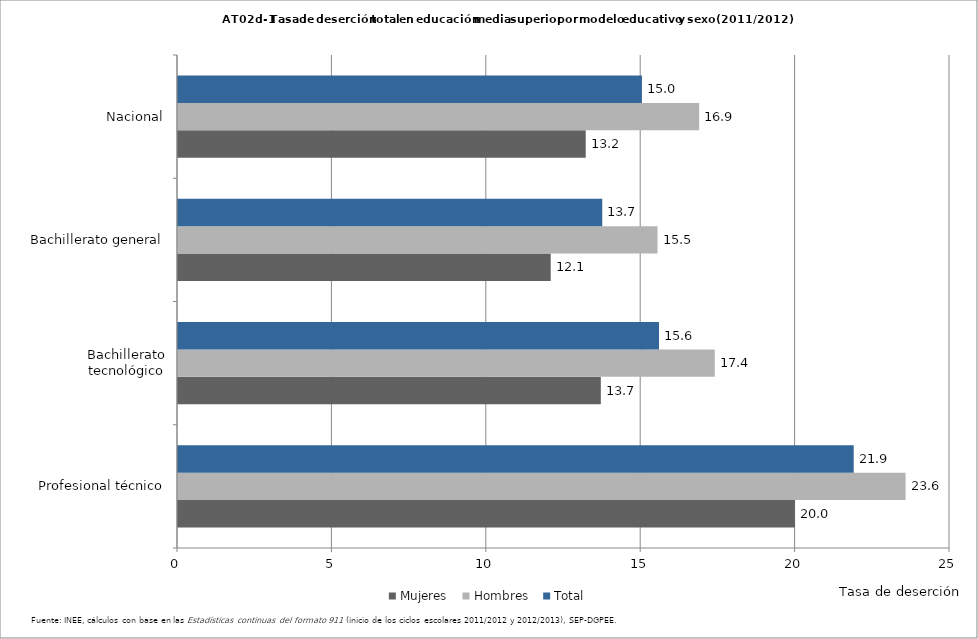
| Category | Mujeres | Hombres | Total |
|---|---|---|---|
| Profesional técnico | 19.978 | 23.562 | 21.881 |
| Bachillerato tecnológico | 13.693 | 17.383 | 15.577 |
| Bachillerato general | 12.07 | 15.528 | 13.739 |
| Nacional | 13.204 | 16.877 | 15.024 |